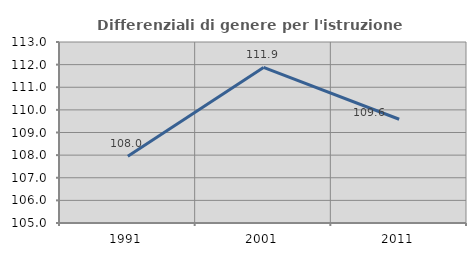
| Category | Differenziali di genere per l'istruzione superiore |
|---|---|
| 1991.0 | 107.951 |
| 2001.0 | 111.877 |
| 2011.0 | 109.586 |